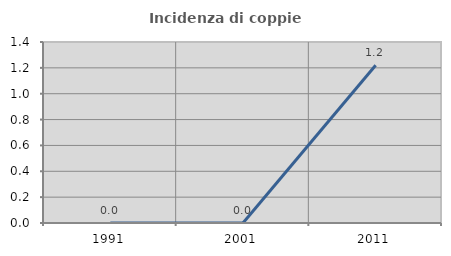
| Category | Incidenza di coppie miste |
|---|---|
| 1991.0 | 0 |
| 2001.0 | 0 |
| 2011.0 | 1.22 |